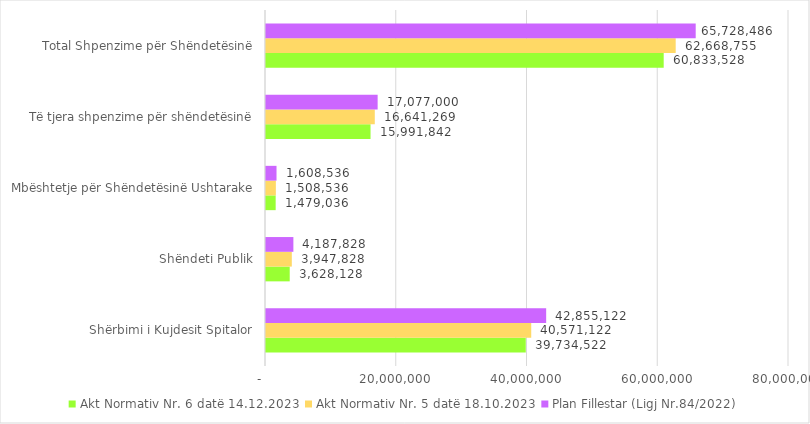
| Category | Akt Normativ Nr. 6 datë 14.12.2023 | Akt Normativ Nr. 5 datë 18.10.2023 | Plan Fillestar (Ligj Nr.84/2022) |
|---|---|---|---|
| Shërbimi i Kujdesit Spitalor | 39734522 | 40571122 | 42855122 |
| Shëndeti Publik | 3628128 | 3947828 | 4187828 |
| Mbështetje për Shëndetësinë Ushtarake | 1479036 | 1508536 | 1608536 |
| Të tjera shpenzime për shëndetësinë | 15991842 | 16641268.621 | 17077000 |
| Total Shpenzime për Shëndetësinë | 60833528 | 62668754.621 | 65728486 |